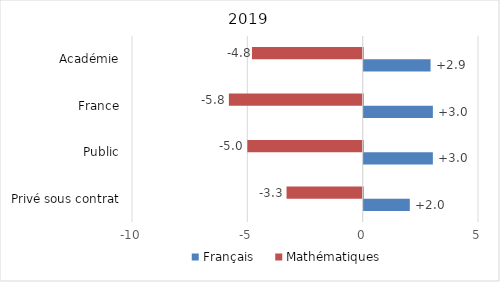
| Category | Français | Mathématiques |
|---|---|---|
| Privé sous contrat | 2 | -3.3 |
| Public | 3 | -5 |
| France | 3 | -5.8 |
| Académie | 2.9 | -4.8 |